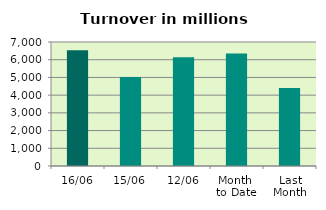
| Category | Series 0 |
|---|---|
| 16/06 | 6539.266 |
| 15/06 | 5027.421 |
| 12/06 | 6133.042 |
| Month 
to Date | 6354.071 |
| Last
Month | 4406.275 |